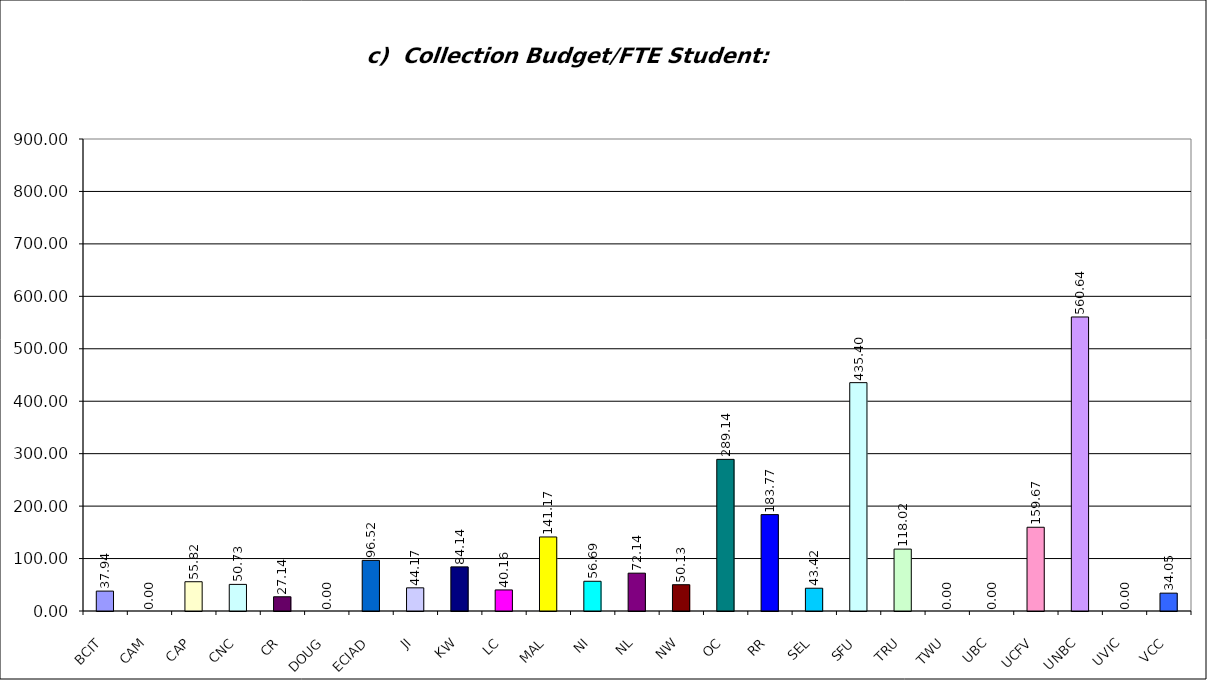
| Category | c)  Collection Budget/FTE Student:  7(j)/3(a) |
|---|---|
| BCIT | 37.943 |
| CAM | 0 |
| CAP | 55.822 |
| CNC | 50.731 |
| CR | 27.135 |
| DOUG | 0 |
| ECIAD | 96.519 |
| JI | 44.166 |
| KW | 84.135 |
| LC | 40.163 |
| MAL | 141.173 |
| NI | 56.69 |
| NL | 72.143 |
| NW | 50.133 |
| OC | 289.142 |
| RR | 183.767 |
| SEL | 43.416 |
| SFU | 435.404 |
| TRU | 118.02 |
| TWU | 0 |
| UBC | 0 |
| UCFV | 159.668 |
| UNBC | 560.637 |
| UVIC | 0 |
| VCC | 34.053 |